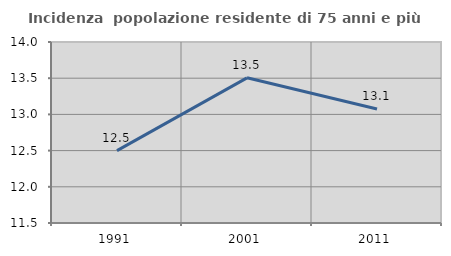
| Category | Incidenza  popolazione residente di 75 anni e più |
|---|---|
| 1991.0 | 12.5 |
| 2001.0 | 13.505 |
| 2011.0 | 13.074 |